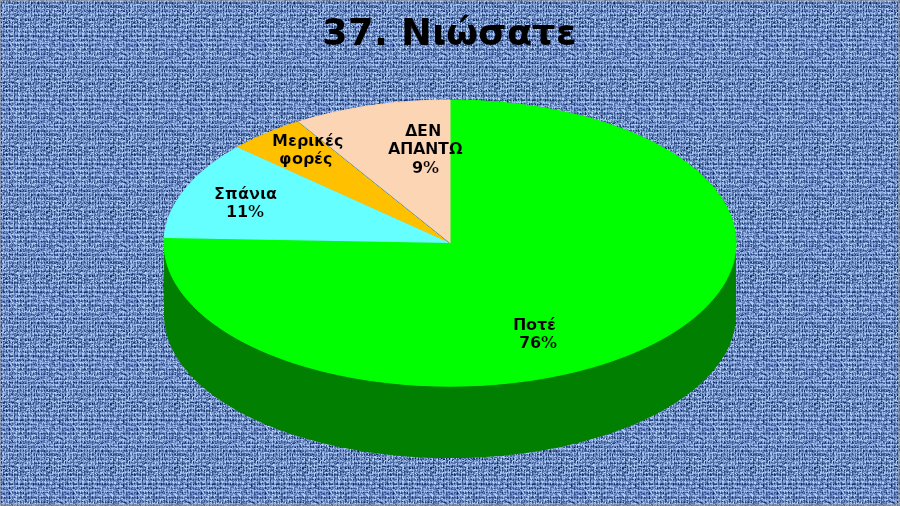
| Category | Series 0 |
|---|---|
| Ποτέ  | 34 |
| Σπάνια  | 5 |
| Μερικές φορές  | 2 |
| Συχνά  | 0 |
| Συνήθως  | 0 |
| ΔΕΝ ΑΠΑΝΤΩ | 4 |